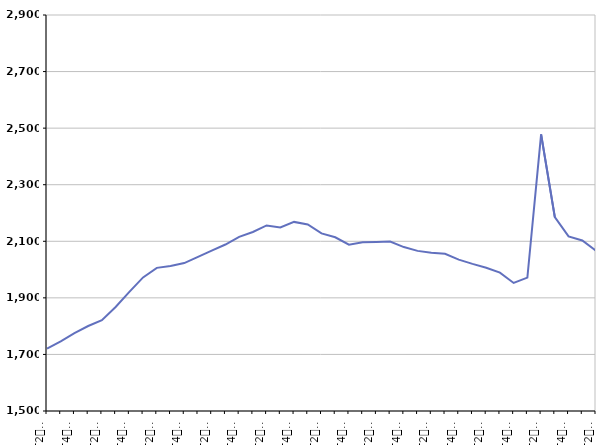
| Category | De 25 à 49 ans |
|---|---|
| T2
2011 | 1720.8 |
| T3
2011 | 1746.5 |
| T4
2011 | 1775.3 |
| T1
2012 | 1800.4 |
| T2
2012 | 1820.8 |
| T3
2012 | 1867.9 |
| T4
2012 | 1921.1 |
| T1
2013 | 1972.3 |
| T2
2013 | 2006.1 |
| T3
2013 | 2012.4 |
| T4
2013 | 2022.9 |
| T1
2014 | 2044.7 |
| T2
2014 | 2067.2 |
| T3
2014 | 2088.5 |
| T4
2014 | 2115.8 |
| T1
2015 | 2133 |
| T2
2015 | 2156 |
| T3
2015 | 2148.7 |
| T4
2015 | 2168.5 |
| T1
2016 | 2159.6 |
| T2
2016 | 2128 |
| T3
2016 | 2114.1 |
| T4
2016 | 2088.1 |
| T1
2017 | 2096.9 |
| T2
2017 | 2097.9 |
| T3
2017 | 2099.2 |
| T4
2017 | 2079.5 |
| T1
2018 | 2066.1 |
| T2
2018 | 2059.3 |
| T3
2018 | 2055.7 |
| T4
2018 | 2035.2 |
| T1
2019 | 2020.1 |
| T2
2019 | 2006.6 |
| T3
2019 | 1989.3 |
| T4
2019 | 1952.6 |
| T1
2020 | 1971.6 |
| T2
2020 | 2478 |
| T3
2020 | 2185.2 |
| T4
2020 | 2117.2 |
| T1
2021 | 2102.8 |
| T2
2021 | 2066.3 |